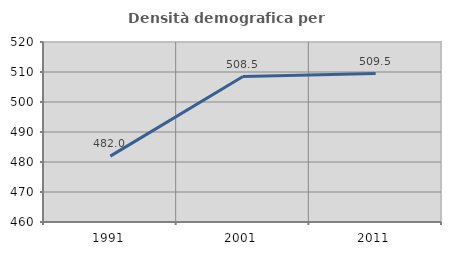
| Category | Densità demografica |
|---|---|
| 1991.0 | 481.958 |
| 2001.0 | 508.484 |
| 2011.0 | 509.46 |